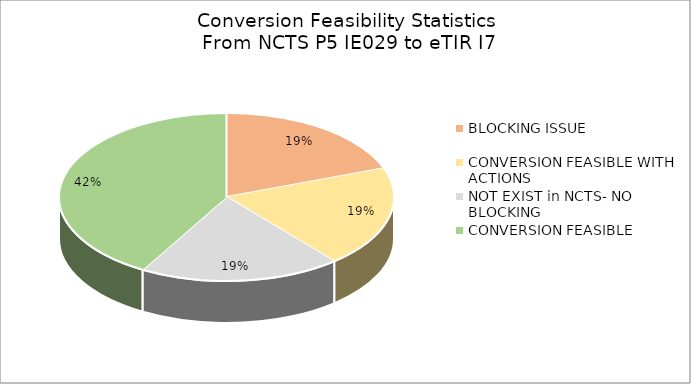
| Category | Total |
|---|---|
| BLOCKING ISSUE | 7 |
| CONVERSION FEASIBLE WITH ACTIONS  | 7 |
| NOT EXIST in NCTS- NO BLOCKING | 7 |
| COΝVERSION FEASIBLE | 15 |